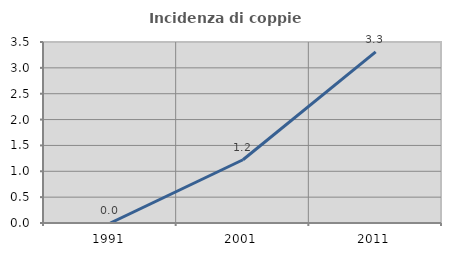
| Category | Incidenza di coppie miste |
|---|---|
| 1991.0 | 0 |
| 2001.0 | 1.223 |
| 2011.0 | 3.31 |